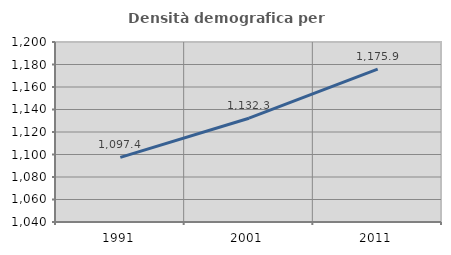
| Category | Densità demografica |
|---|---|
| 1991.0 | 1097.448 |
| 2001.0 | 1132.26 |
| 2011.0 | 1175.862 |